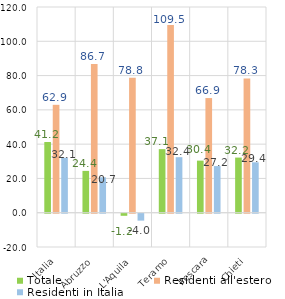
| Category | Totale | Residenti all'estero | Residenti in Italia |
|---|---|---|---|
| Italia | 41.235 | 62.932 | 32.094 |
|   Abruzzo | 24.397 | 86.727 | 20.67 |
|     L'Aquila | -1.219 | 78.799 | -4.031 |
|     Teramo | 37.081 | 109.517 | 32.392 |
|     Pescara | 30.386 | 66.879 | 27.21 |
|     Chieti | 32.163 | 78.302 | 29.416 |